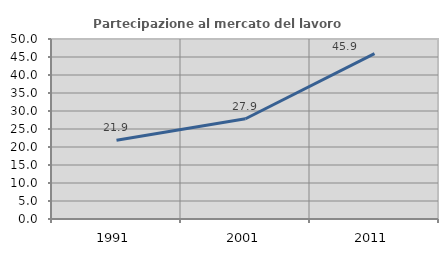
| Category | Partecipazione al mercato del lavoro  femminile |
|---|---|
| 1991.0 | 21.875 |
| 2001.0 | 27.854 |
| 2011.0 | 45.933 |